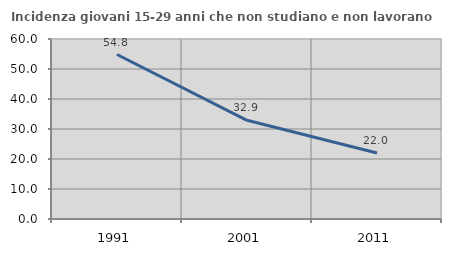
| Category | Incidenza giovani 15-29 anni che non studiano e non lavorano  |
|---|---|
| 1991.0 | 54.825 |
| 2001.0 | 32.89 |
| 2011.0 | 22.009 |